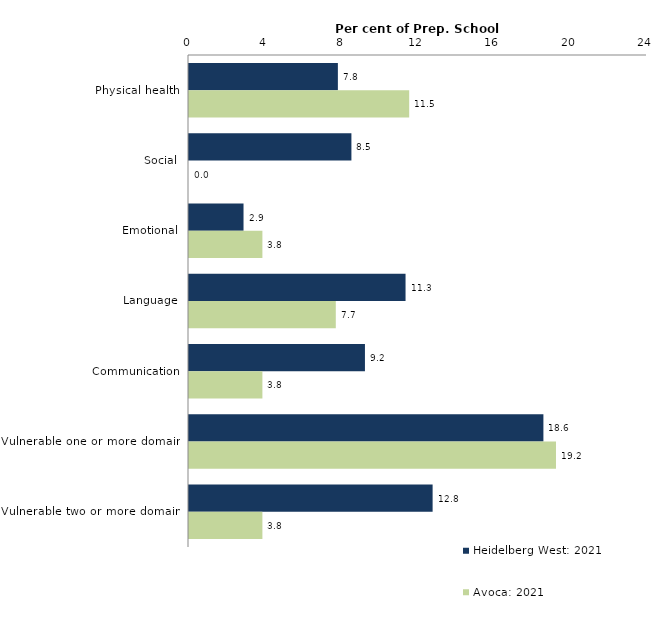
| Category | Heidelberg West: 2021 | Avoca: 2021 |
|---|---|---|
| Physical health | 7.801 | 11.538 |
| Social | 8.511 | 0 |
| Emotional | 2.857 | 3.846 |
| Language | 11.348 | 7.692 |
| Communication | 9.22 | 3.846 |
| Vulnerable one or more domains | 18.571 | 19.231 |
| Vulnerable two or more domains | 12.766 | 3.846 |